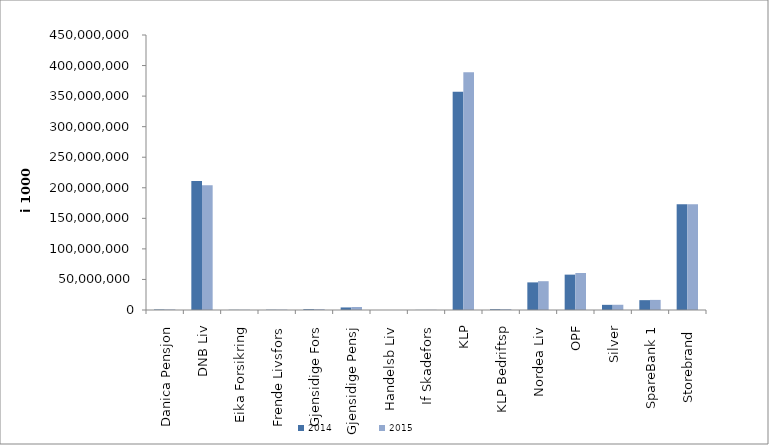
| Category | 2014 | 2015 |
|---|---|---|
| Danica Pensjon | 835085.997 | 893959.117 |
| DNB Liv | 211201092 | 204051672 |
| Eika Forsikring | 304508 | 377974 |
| Frende Livsfors | 451614.236 | 585097 |
| Gjensidige Fors | 1300272 | 1246980 |
| Gjensidige Pensj | 4186194.973 | 4877540 |
| Handelsb Liv | 25863 | 29117 |
| If Skadefors | 162133.44 | 311920 |
| KLP | 357104694.072 | 388913820.936 |
| KLP Bedriftsp | 1254754 | 1379522 |
| Nordea Liv | 45189000 | 47126733.776 |
| OPF | 57875524 | 60552187 |
| Silver | 8444246.043 | 8556698.353 |
| SpareBank 1 | 16117636.38 | 16536094.94 |
| Storebrand  | 172892286.761 | 173057918.175 |